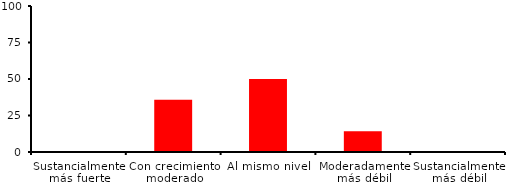
| Category | Series 0 |
|---|---|
| Sustancialmente más fuerte | 0 |
| Con crecimiento moderado | 35.714 |
| Al mismo nivel | 50 |
| Moderadamente más débil | 14.286 |
| Sustancialmente más débil | 0 |